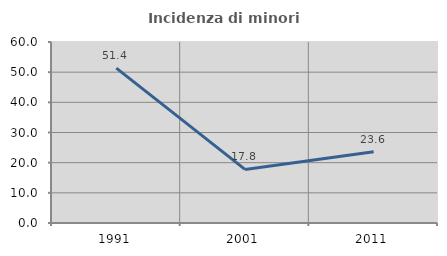
| Category | Incidenza di minori stranieri |
|---|---|
| 1991.0 | 51.351 |
| 2001.0 | 17.757 |
| 2011.0 | 23.588 |